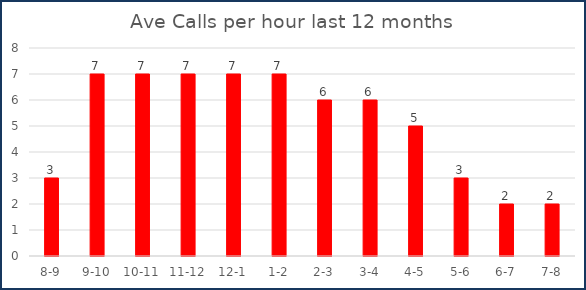
| Category | Ave calls YTD |
|---|---|
| 8-9 | 3 |
| 9-10 | 7 |
| 10-11 | 7 |
| 11-12 | 7 |
| 12-1 | 7 |
| 1-2 | 7 |
| 2-3 | 6 |
| 3-4 | 6 |
| 4-5 | 5 |
| 5-6 | 3 |
| 6-7 | 2 |
| 7-8 | 2 |